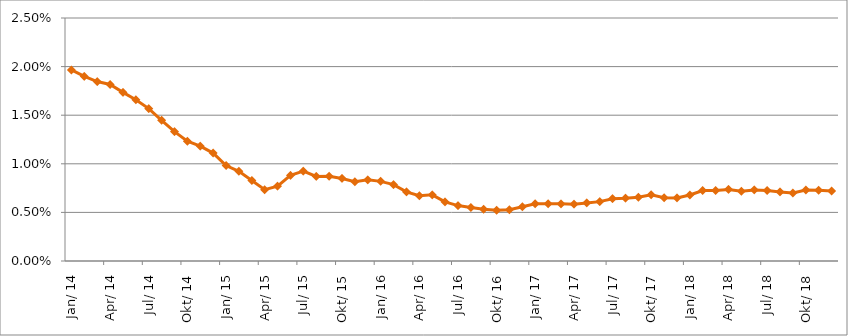
| Category | Durchschnittszins |
|---|---|
| 2014-01-01 | 0.02 |
| 2014-02-01 | 0.019 |
| 2014-03-01 | 0.018 |
| 2014-04-01 | 0.018 |
| 2014-05-01 | 0.017 |
| 2014-06-01 | 0.017 |
| 2014-07-01 | 0.016 |
| 2014-08-01 | 0.014 |
| 2014-09-01 | 0.013 |
| 2014-10-01 | 0.012 |
| 2014-11-01 | 0.012 |
| 2014-12-01 | 0.011 |
| 2015-01-01 | 0.01 |
| 2015-02-01 | 0.009 |
| 2015-03-01 | 0.008 |
| 2015-04-01 | 0.007 |
| 2015-05-01 | 0.008 |
| 2015-06-01 | 0.009 |
| 2015-07-01 | 0.009 |
| 2015-08-01 | 0.009 |
| 2015-09-01 | 0.009 |
| 2015-10-01 | 0.008 |
| 2015-11-01 | 0.008 |
| 2015-12-01 | 0.008 |
| 2016-01-01 | 0.008 |
| 2016-02-01 | 0.008 |
| 2016-03-01 | 0.007 |
| 2016-04-01 | 0.007 |
| 2016-05-01 | 0.007 |
| 2016-06-01 | 0.006 |
| 2016-07-01 | 0.006 |
| 2016-08-01 | 0.005 |
| 2016-09-01 | 0.005 |
| 2016-10-01 | 0.005 |
| 2016-11-01 | 0.005 |
| 2016-12-01 | 0.006 |
| 2017-01-01 | 0.006 |
| 2017-02-01 | 0.006 |
| 2017-03-01 | 0.006 |
| 2017-04-01 | 0.006 |
| 2017-05-01 | 0.006 |
| 2017-06-01 | 0.006 |
| 2017-07-01 | 0.006 |
| 2017-08-01 | 0.006 |
| 2017-09-01 | 0.007 |
| 2017-10-01 | 0.007 |
| 2017-11-01 | 0.007 |
| 2017-12-01 | 0.006 |
| 2018-01-01 | 0.007 |
| 2018-02-01 | 0.007 |
| 2018-03-01 | 0.007 |
| 2018-04-01 | 0.007 |
| 2018-05-01 | 0.007 |
| 2018-06-01 | 0.007 |
| 2018-07-01 | 0.007 |
| 2018-08-01 | 0.007 |
| 2018-09-01 | 0.007 |
| 2018-10-01 | 0.007 |
| 2018-11-01 | 0.007 |
| 2018-12-01 | 0.007 |